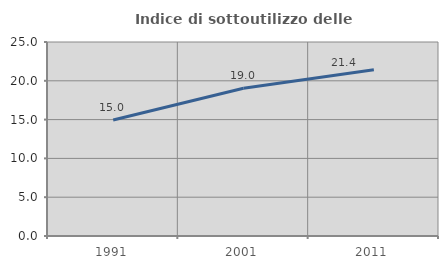
| Category | Indice di sottoutilizzo delle abitazioni  |
|---|---|
| 1991.0 | 14.958 |
| 2001.0 | 19.043 |
| 2011.0 | 21.426 |